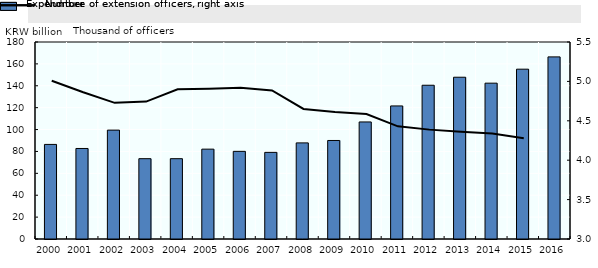
| Category | Expenditure |
|---|---|
| 2000.0 | 86.426 |
| 2001.0 | 82.716 |
| 2002.0 | 99.48 |
| 2003.0 | 73.384 |
| 2004.0 | 73.384 |
| 2005.0 | 82.099 |
| 2006.0 | 80.081 |
| 2007.0 | 79.15 |
| 2008.0 | 87.816 |
| 2009.0 | 90.015 |
| 2010.0 | 106.959 |
| 2011.0 | 121.581 |
| 2012.0 | 140.49 |
| 2013.0 | 147.818 |
| 2014.0 | 142.393 |
| 2015.0 | 155.166 |
| 2016.0 | 166.396 |